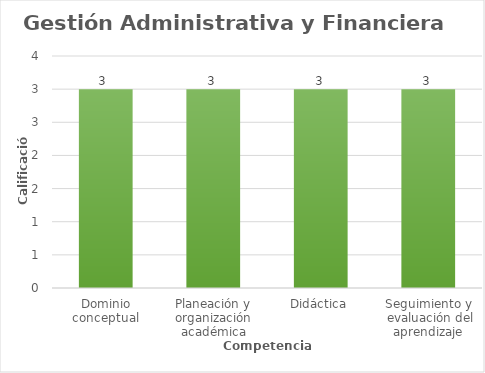
| Category | Series 0 |
|---|---|
| Dominio conceptual | 3 |
| Planeación y organización académica | 3 |
| Didáctica | 3 |
| Seguimiento y
 evaluación del
aprendizaje | 3 |